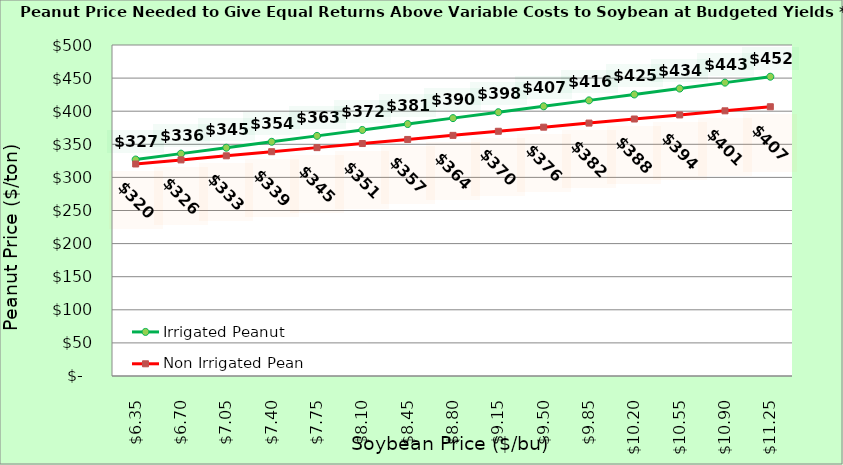
| Category | Irrigated Peanut | Non Irrigated Peanut |
|---|---|---|
| 6.350000000000003 | 326.985 | 320.27 |
| 6.700000000000003 | 335.921 | 326.446 |
| 7.0500000000000025 | 344.857 | 332.622 |
| 7.400000000000002 | 353.794 | 338.799 |
| 7.750000000000002 | 362.73 | 344.975 |
| 8.100000000000001 | 371.666 | 351.152 |
| 8.450000000000001 | 380.602 | 357.328 |
| 8.8 | 389.538 | 363.505 |
| 9.15 | 398.474 | 369.681 |
| 9.5 | 407.411 | 375.858 |
| 9.85 | 416.347 | 382.034 |
| 10.2 | 425.283 | 388.211 |
| 10.549999999999999 | 434.219 | 394.387 |
| 10.899999999999999 | 443.155 | 400.564 |
| 11.249999999999998 | 452.092 | 406.74 |